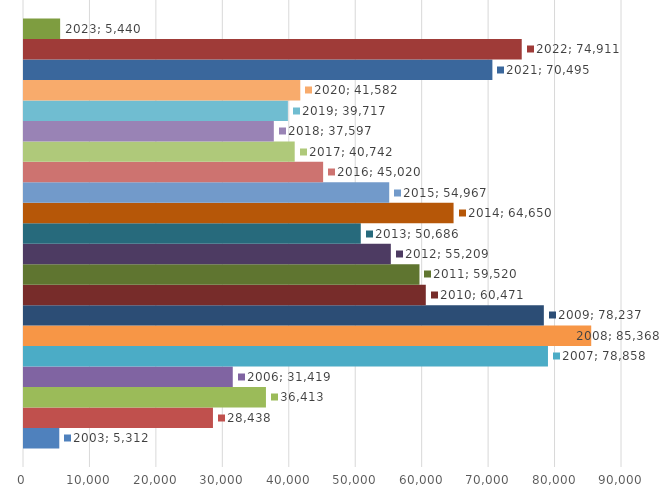
| Category | 2003 | 2004 | 2005 | 2006 | 2007 | 2008 | 2009 | 2010 | 2011 | 2012 | 2013 | 2014 | 2015 | 2016 | 2017 | 2018 | 2019 | 2020 | 2021 | 2022 | 2023 |
|---|---|---|---|---|---|---|---|---|---|---|---|---|---|---|---|---|---|---|---|---|---|
| 0 | 5312 | 28438 | 36413 | 31419 | 78858 | 85368 | 78237 | 60471 | 59520 | 55209 | 50686 | 64650 | 54967 | 45020 | 40742 | 37597 | 39717 | 41582 | 70495 | 74911 | 5440 |